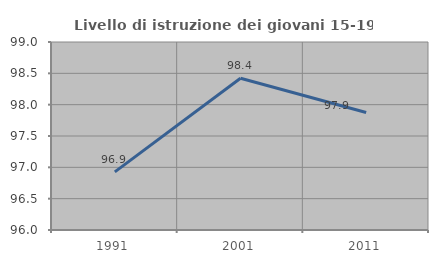
| Category | Livello di istruzione dei giovani 15-19 anni |
|---|---|
| 1991.0 | 96.927 |
| 2001.0 | 98.422 |
| 2011.0 | 97.875 |